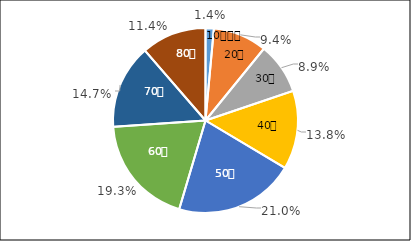
| Category | Series 0 |
|---|---|
| 0 | 0.014 |
| 1 | 0.094 |
| 2 | 0.089 |
| 3 | 0.138 |
| 4 | 0.21 |
| 5 | 0.193 |
| 6 | 0.147 |
| 7 | 0.114 |